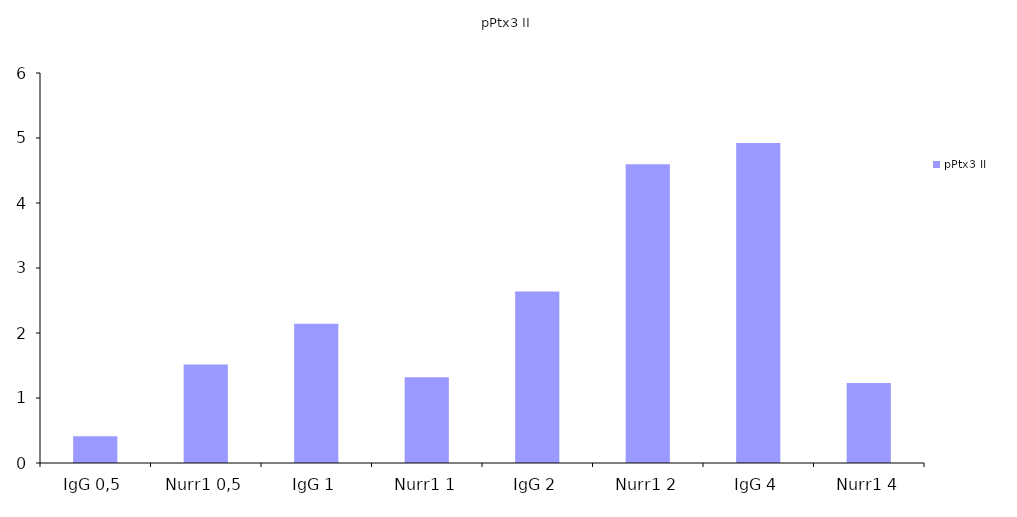
| Category | pPtx3 II |
|---|---|
| IgG 0,5 | 0.412 |
| Nurr1 0,5 | 1.516 |
| IgG 1 | 2.144 |
| Nurr1 1 | 1.32 |
| IgG 2 | 2.639 |
| Nurr1 2 | 4.595 |
| IgG 4 | 4.925 |
| Nurr1 4 | 1.231 |